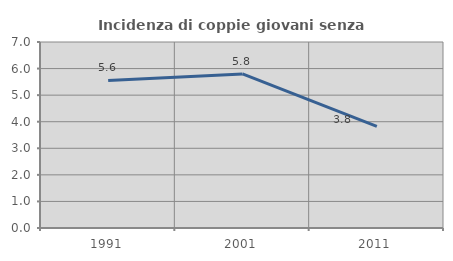
| Category | Incidenza di coppie giovani senza figli |
|---|---|
| 1991.0 | 5.556 |
| 2001.0 | 5.797 |
| 2011.0 | 3.822 |